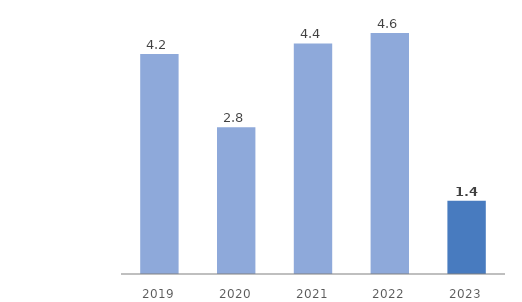
| Category | Assets in Kazakhstan |
|---|---|
| 2019.0 | 4.2 |
| 2020.0 | 2.8 |
| 2021.0 | 4.4 |
| 2022.0 | 4.6 |
| 2023.0 | 1.4 |